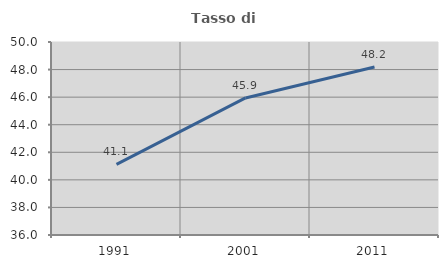
| Category | Tasso di occupazione   |
|---|---|
| 1991.0 | 41.126 |
| 2001.0 | 45.942 |
| 2011.0 | 48.185 |